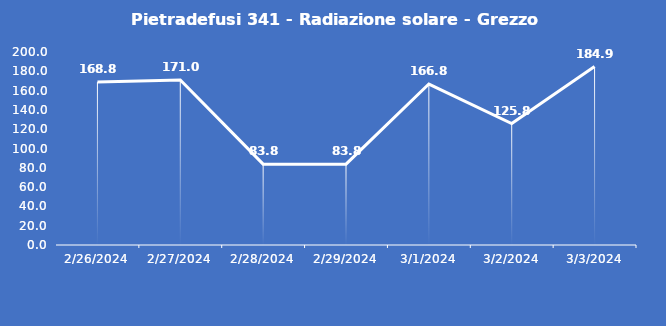
| Category | Pietradefusi 341 - Radiazione solare - Grezzo (W/m2) |
|---|---|
| 2/26/24 | 168.8 |
| 2/27/24 | 171 |
| 2/28/24 | 83.8 |
| 2/29/24 | 83.8 |
| 3/1/24 | 166.8 |
| 3/2/24 | 125.8 |
| 3/3/24 | 184.9 |